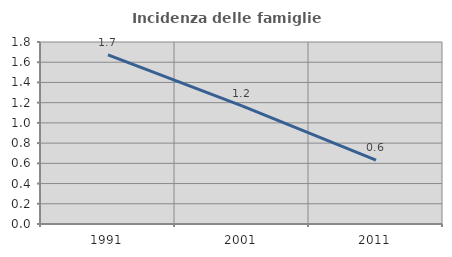
| Category | Incidenza delle famiglie numerose |
|---|---|
| 1991.0 | 1.672 |
| 2001.0 | 1.168 |
| 2011.0 | 0.632 |